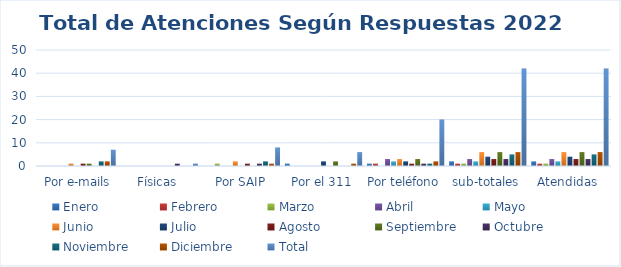
| Category | Enero | Febrero | Marzo | Abril | Mayo | Junio | Julio | Agosto  | Septiembre | Octubre | Noviembre | Diciembre | Total |
|---|---|---|---|---|---|---|---|---|---|---|---|---|---|
|  Por e-mails | 0 | 0 | 0 | 0 | 0 | 1 | 0 | 1 | 1 | 0 | 2 | 2 | 7 |
| Físicas | 0 | 0 | 0 | 0 | 0 | 0 | 0 | 0 | 0 | 1 | 0 | 0 | 1 |
| Por SAIP | 0 | 0 | 1 | 0 | 0 | 2 | 0 | 1 | 0 | 1 | 2 | 1 | 8 |
| Por el 311 | 1 | 0 | 0 | 0 | 0 | 0 | 2 | 0 | 2 | 0 | 0 | 1 | 6 |
| Por teléfono | 1 | 1 | 0 | 3 | 2 | 3 | 2 | 1 | 3 | 1 | 1 | 2 | 20 |
| sub-totales | 2 | 1 | 1 | 3 | 2 | 6 | 4 | 3 | 6 | 3 | 5 | 6 | 42 |
| Atendidas | 2 | 1 | 1 | 3 | 2 | 6 | 4 | 3 | 6 | 3 | 5 | 6 | 42 |